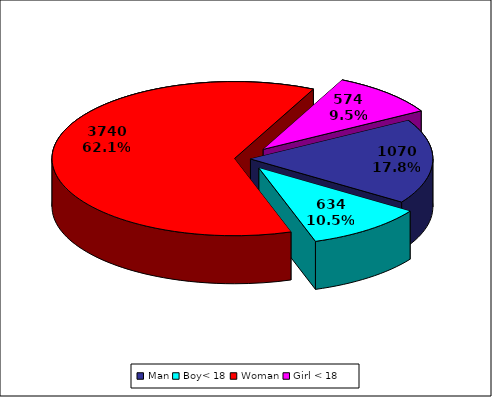
| Category | TOTAL |
|---|---|
| Man | 1070 |
| Boy< 18 | 634 |
| Woman | 3740 |
| Girl < 18 | 574 |